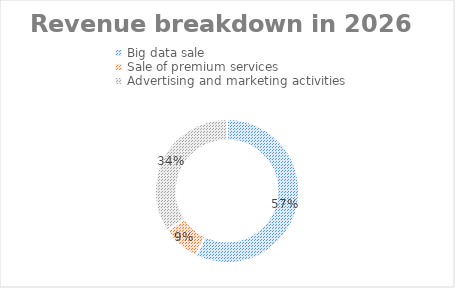
| Category | Big data sale |
|---|---|
| Big data sale | 0.571 |
| Sale of premium services | 0.086 |
| Advertising and marketing activities | 0.343 |